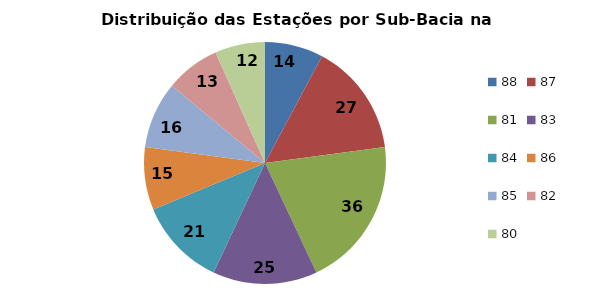
| Category | N° de Estaçõesb |
|---|---|
| 88.0 | 14 |
| 87.0 | 27 |
| 81.0 | 36 |
| 83.0 | 25 |
| 84.0 | 21 |
| 86.0 | 15 |
| 85.0 | 16 |
| 82.0 | 13 |
| 80.0 | 12 |